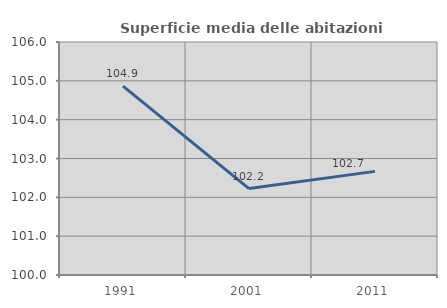
| Category | Superficie media delle abitazioni occupate |
|---|---|
| 1991.0 | 104.865 |
| 2001.0 | 102.226 |
| 2011.0 | 102.669 |